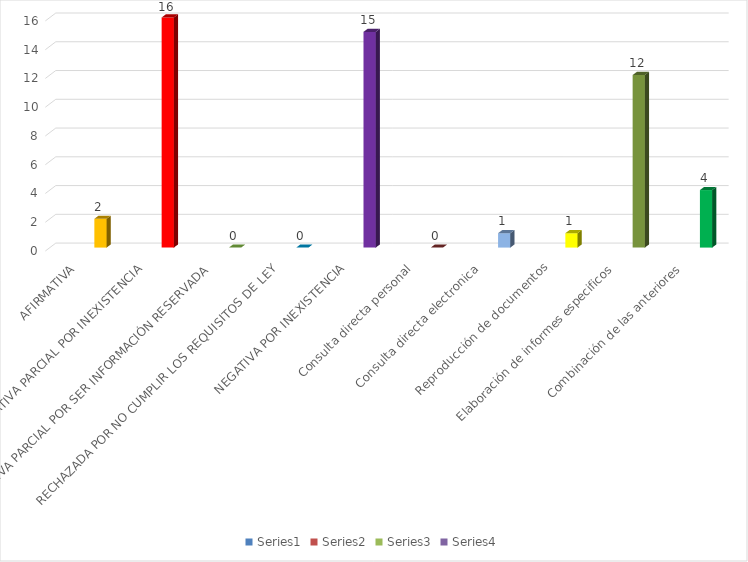
| Category | Series 0 | Series 1 | Series 2 | Series 3 |
|---|---|---|---|---|
| AFIRMATIVA |  |  |  | 2 |
| AFIRMATIVA PARCIAL POR INEXISTENCIA |  |  |  | 16 |
| AFIRMATIVA PARCIAL POR SER INFORMACIÓN RESERVADA |  |  |  | 0 |
| RECHAZADA POR NO CUMPLIR LOS REQUISITOS DE LEY |  |  |  | 0 |
| NEGATIVA POR INEXISTENCIA |  |  |  | 15 |
| Consulta directa personal |  |  |  | 0 |
| Consulta directa electronica |  |  |  | 1 |
| Reproducción de documentos |  |  |  | 1 |
| Elaboración de informes especificos |  |  |  | 12 |
| Combinación de las anteriores |  |  |  | 4 |